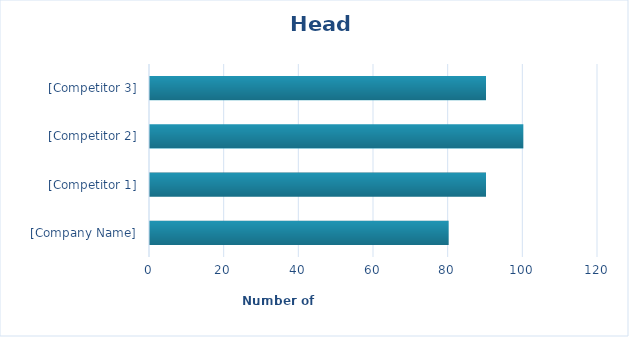
| Category | Series 22 |
|---|---|
| [Company Name] | 80 |
| [Competitor 1] | 90 |
| [Competitor 2] | 100 |
| [Competitor 3] | 90 |